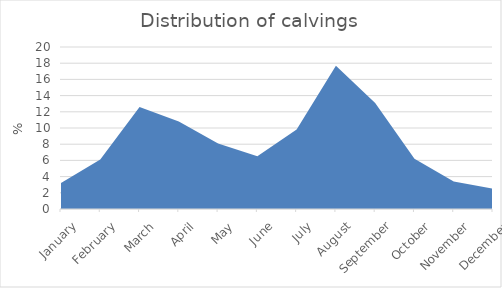
| Category | Series 0 |
|---|---|
| January | 3.2 |
| February | 6.1 |
| March | 12.6 |
| April | 10.8 |
| May | 8.1 |
| June | 6.5 |
| July | 9.8 |
| August | 17.7 |
| September | 13.1 |
| October | 6.2 |
| November | 3.4 |
| December | 2.5 |